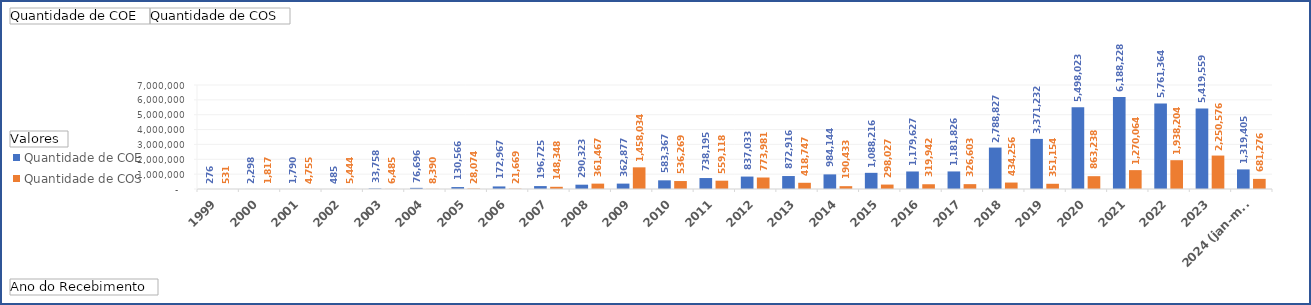
| Category | Quantidade de COE | Quantidade de COS |
|---|---|---|
| 1999 | 276 | 531 |
| 2000 | 2298 | 1817 |
| 2001 | 1790 | 4755 |
| 2002 | 485 | 5444 |
| 2003 | 33758 | 6485 |
| 2004 | 76696 | 8390 |
| 2005 | 130566 | 28074 |
| 2006 | 172967 | 21669 |
| 2007 | 196725 | 148348 |
| 2008 | 290323 | 361467 |
| 2009 | 362877 | 1458034 |
| 2010 | 583367 | 536269 |
| 2011 | 738195 | 559118 |
| 2012 | 837033 | 773981 |
| 2013 | 872916 | 418747 |
| 2014 | 984144 | 190433 |
| 2015 | 1088216 | 298027 |
| 2016 | 1179627 | 319942 |
| 2017 | 1181826 | 326603 |
| 2018 | 2788827 | 434256 |
| 2019 | 3371232 | 351154 |
| 2020 | 5498023 | 863238 |
| 2021 | 6188228 | 1270064 |
| 2022 | 5761364 | 1938204 |
| 2023 | 5419559 | 2250576 |
| 2024 (jan-mar) | 1319405 | 681276 |